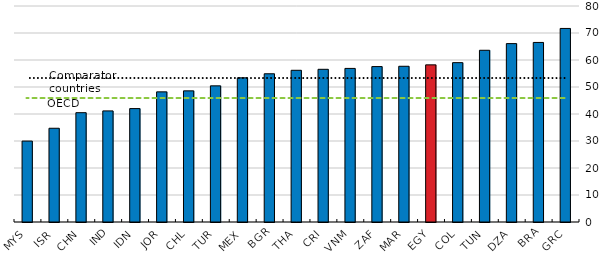
| Category | Legal framework's adaptability to digital business models |
|---|---|
| GRC | 71.69 |
| BRA | 66.503 |
| DZA | 66.067 |
| TUN | 63.602 |
| COL | 59.017 |
| EGY | 58.196 |
| MAR | 57.674 |
| ZAF | 57.561 |
| VNM | 56.883 |
| CRI | 56.556 |
| THA | 56.188 |
| BGR | 54.899 |
| MEX | 53.394 |
| TUR | 50.427 |
| CHL | 48.568 |
| JOR | 48.199 |
| IDN | 42.005 |
| IND | 41.147 |
| CHN | 40.488 |
| ISR | 34.722 |
| MYS | 29.975 |